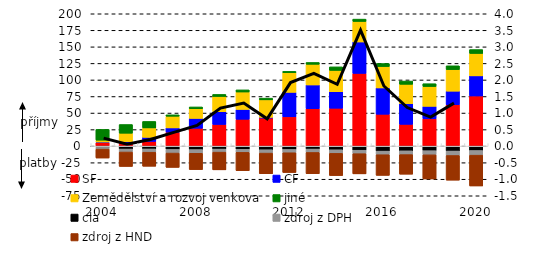
| Category | SF | CF | Zemědělství a rozvoj venkova | jiné | cla | zdroj z DPH | zdroj z HND |
|---|---|---|---|---|---|---|---|
| 2004.0 | 5172.657 | 1017.394 | 2813.745 | 16287.247 | -1910.086 | -2548.833 | -13504.2 |
| 2005.0 | 4412.367 | 2376.086 | 12739.267 | 13154.089 | -4373.7 | -4507.77 | -21822.4 |
| 2006.0 | 7163.386 | 6136.908 | 14250.981 | 9759.069 | -4232.967 | -4934.208 | -21235.2 |
| 2007.0 | 21116.305 | 6449.113 | 17626.511 | 2122.936 | -4967.6 | -5500.6 | -21653.9 |
| 2008.0 | 27054.444 | 14851.307 | 14571.153 | 2745.063 | -5178 | -5603.3 | -24667.3 |
| 2009.0 | 32764.587 | 19142.701 | 23166.956 | 3071.57 | -4441.2 | -4606 | -26780.9 |
| 2010.0 | 40619.41 | 14837.94 | 26353.32 | 3206.808 | -4791.49 | -4618.85 | -27689.73 |
| 2011.0 | 42454.848 | 1000.608 | 26465.209 | 2592.753 | -5416.19 | -5098.84 | -31228.14 |
| 2012.0 | 44317.03 | 36973.114 | 29722.744 | 1963.46 | -5001.785 | -4988.359 | -29856.418 |
| 2013.0 | 56533.248 | 35920.022 | 31246.773 | 2714.947 | -4431.876 | -5134.032 | -32095.426 |
| 2014.0 | 57303.112 | 24830.231 | 32312.712 | 5347.536 | -5448.215 | -5458.354 | -33569.448 |
| 2015.0 | 109929.652 | 47478.337 | 31023.101 | 3496.159 | -6169.563 | -5244.002 | -30485.636 |
| 2016.0 | 48210.545 | 39746.77 | 32335.538 | 4524.66 | -7503.025 | -5482.649 | -31204.743 |
| 2017.0 | 32965.706 | 31124.819 | 29354.928 | 4915.579 | -7056.312 | -5740.768 | -29612.069 |
| 2018.0 | 41286.675 | 18867.317 | 29961.876 | 4218.99 | -6852.641 | -6288.573 | -36460.025 |
| 2019.0 | 62565.253 | 20501.711 | 32604.314 | 5721.005 | -7368.057 | -6771.933 | -37278.231 |
| 2020.0 | 75801.209 | 30384.96 | 33852.719 | 5893.045 | -6582.491 | -7038.936 | -46568.164 |